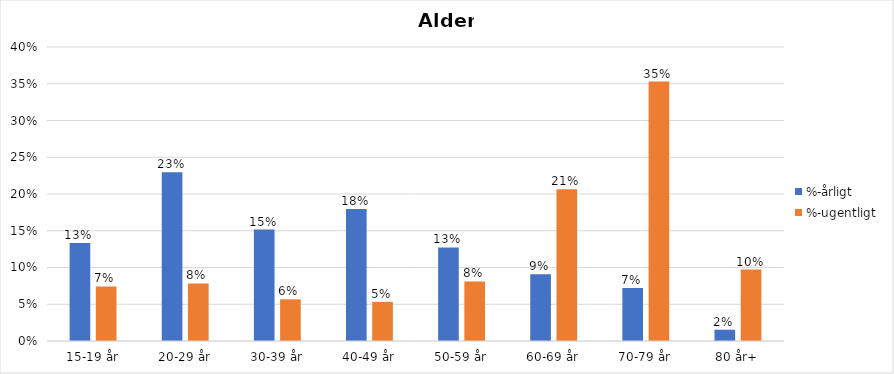
| Category | %-årligt | %-ugentligt |
|---|---|---|
| 15-19 år | 0.133 | 0.074 |
| 20-29 år | 0.23 | 0.078 |
| 30-39 år | 0.152 | 0.057 |
| 40-49 år | 0.18 | 0.053 |
| 50-59 år | 0.127 | 0.081 |
| 60-69 år | 0.091 | 0.206 |
| 70-79 år | 0.072 | 0.353 |
| 80 år+ | 0.015 | 0.097 |